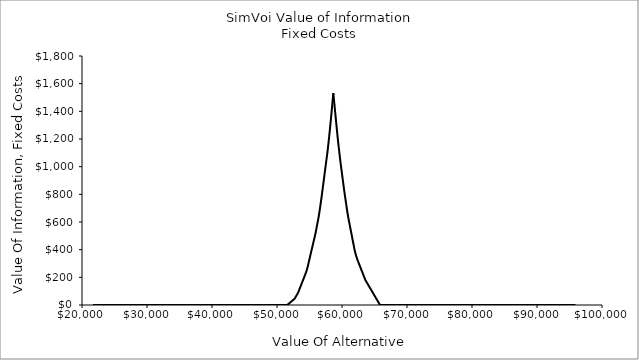
| Category | Fixed Costs |
|---|---|
| 21700.42155301782 | 0 |
| 21848.897025111157 | 0 |
| 21997.3724972045 | 0 |
| 22145.847969297836 | 0 |
| 22294.323441391174 | 0 |
| 22442.798913484516 | 0 |
| 22591.274385577854 | 0 |
| 22739.749857671195 | 0 |
| 22888.225329764533 | 0 |
| 23036.70080185787 | 0 |
| 23185.176273951212 | 0 |
| 23333.65174604455 | 0 |
| 23482.127218137888 | 0 |
| 23630.60269023123 | 0 |
| 23779.078162324568 | 0 |
| 23927.553634417905 | 0 |
| 24076.029106511247 | 0 |
| 24224.504578604585 | 0 |
| 24372.980050697923 | 0 |
| 24521.455522791264 | 0 |
| 24669.930994884602 | 0 |
| 24818.40646697794 | 0 |
| 24966.88193907128 | 0 |
| 25115.35741116462 | 0 |
| 25263.83288325796 | 0 |
| 25412.3083553513 | 0 |
| 25560.783827444637 | 0 |
| 25709.25929953798 | 0 |
| 25857.734771631316 | 0 |
| 26006.210243724658 | 0 |
| 26154.685715817996 | 0 |
| 26303.161187911333 | 0 |
| 26451.636660004675 | 0 |
| 26600.112132098013 | 0 |
| 26748.58760419135 | 0 |
| 26897.063076284692 | 0 |
| 27045.53854837803 | 0 |
| 27194.014020471368 | 0 |
| 27342.48949256471 | 0 |
| 27490.964964658047 | 0 |
| 27639.440436751385 | 0 |
| 27787.915908844727 | 0 |
| 27936.391380938065 | 0 |
| 28084.866853031403 | 0 |
| 28233.342325124744 | 0 |
| 28381.817797218082 | 0 |
| 28530.29326931142 | 0 |
| 28678.76874140476 | 0 |
| 28827.2442134981 | 0 |
| 28975.719685591437 | 0 |
| 29124.19515768478 | 0 |
| 29272.670629778117 | 0 |
| 29421.146101871458 | 0 |
| 29569.621573964796 | 0 |
| 29718.097046058137 | 0 |
| 29866.572518151475 | 0 |
| 30015.047990244813 | 0 |
| 30163.523462338155 | 0 |
| 30311.998934431493 | 0 |
| 30460.47440652483 | 0 |
| 30608.949878618172 | 0 |
| 30757.42535071151 | 0 |
| 30905.900822804848 | 0 |
| 31054.37629489819 | 0 |
| 31202.851766991527 | 0 |
| 31351.327239084865 | 0 |
| 31499.802711178207 | 0 |
| 31648.278183271545 | 0 |
| 31796.753655364882 | 0 |
| 31945.229127458224 | 0 |
| 32093.704599551562 | 0 |
| 32242.1800716449 | 0 |
| 32390.65554373824 | 0 |
| 32539.13101583158 | 0 |
| 32687.606487924917 | 0 |
| 32836.08196001826 | 0 |
| 32984.5574321116 | 0 |
| 33133.032904204934 | 0 |
| 33281.508376298276 | 0 |
| 33429.98384839162 | 0 |
| 33578.45932048495 | 0 |
| 33726.93479257829 | 0 |
| 33875.410264671635 | 0 |
| 34023.885736764976 | 0 |
| 34172.36120885831 | 0 |
| 34320.83668095165 | 0 |
| 34469.312153044986 | 0 |
| 34617.78762513833 | 0 |
| 34766.26309723167 | 0 |
| 34914.73856932501 | 0 |
| 35063.214041418345 | 0 |
| 35211.68951351169 | 0 |
| 35360.16498560502 | 0 |
| 35508.64045769836 | 0 |
| 35657.115929791704 | 0 |
| 35805.591401885045 | 0 |
| 35954.06687397838 | 0 |
| 36102.54234607172 | 0 |
| 36251.017818165055 | 0 |
| 36399.4932902584 | 0 |
| 36547.96876235174 | 0 |
| 36696.44423444508 | 0 |
| 36844.919706538414 | 0 |
| 36993.395178631756 | 0 |
| 37141.8706507251 | 0 |
| 37290.34612281843 | 0 |
| 37438.82159491177 | 0 |
| 37587.297067005115 | 0 |
| 37735.772539098456 | 0 |
| 37884.24801119179 | 0 |
| 38032.72348328513 | 0 |
| 38181.198955378466 | 0 |
| 38329.67442747181 | 0 |
| 38478.14989956515 | 0 |
| 38626.62537165849 | 0 |
| 38775.100843751825 | 0 |
| 38923.57631584517 | 0 |
| 39072.0517879385 | 0 |
| 39220.52726003184 | 0 |
| 39369.002732125184 | 0 |
| 39517.478204218525 | 0 |
| 39665.95367631186 | 0 |
| 39814.4291484052 | 0 |
| 39962.904620498535 | 0 |
| 40111.38009259188 | 0 |
| 40259.85556468522 | 0 |
| 40408.33103677856 | 0 |
| 40556.8065088719 | 0 |
| 40705.281980965236 | 0 |
| 40853.75745305857 | 0 |
| 41002.23292515191 | 0 |
| 41150.70839724525 | 0 |
| 41299.183869338594 | 0 |
| 41447.659341431936 | 0 |
| 41596.13481352527 | 0 |
| 41744.61028561861 | 0 |
| 41893.085757711946 | 0 |
| 42041.56122980529 | 0 |
| 42190.03670189863 | 0 |
| 42338.51217399197 | 0 |
| 42486.987646085305 | 0 |
| 42635.463118178646 | 0 |
| 42783.93859027198 | 0 |
| 42932.41406236532 | 0 |
| 43080.88953445866 | 0 |
| 43229.365006552005 | 0 |
| 43377.84047864534 | 0 |
| 43526.31595073868 | 0 |
| 43674.791422832015 | 0 |
| 43823.26689492536 | 0 |
| 43971.7423670187 | 0 |
| 44120.21783911204 | 0 |
| 44268.69331120538 | 0 |
| 44417.168783298715 | 0 |
| 44565.64425539205 | 0 |
| 44714.11972748539 | 0 |
| 44862.59519957873 | 0 |
| 45011.070671672074 | 0 |
| 45159.546143765416 | 0 |
| 45308.02161585875 | 0 |
| 45456.49708795209 | 0 |
| 45604.972560045426 | 0 |
| 45753.44803213877 | 0 |
| 45901.92350423211 | 0 |
| 46050.39897632545 | 0 |
| 46198.874448418785 | 0 |
| 46347.349920512126 | 0 |
| 46495.82539260546 | 0 |
| 46644.3008646988 | 0 |
| 46792.77633679214 | 0 |
| 46941.251808885485 | 0 |
| 47089.72728097882 | 0 |
| 47238.20275307216 | 0 |
| 47386.678225165495 | 0 |
| 47535.15369725884 | 0 |
| 47683.62916935218 | 0 |
| 47832.10464144552 | 0 |
| 47980.58011353886 | 0 |
| 48129.055585632195 | 0 |
| 48277.53105772553 | 0 |
| 48426.00652981887 | 0 |
| 48574.48200191221 | 0 |
| 48722.957474005554 | 0 |
| 48871.432946098896 | 0 |
| 49019.90841819223 | 0 |
| 49168.383890285564 | 0 |
| 49316.859362378906 | 0 |
| 49465.33483447225 | 0 |
| 49613.81030656559 | 0 |
| 49762.28577865893 | 0 |
| 49910.761250752264 | 0 |
| 50059.236722845606 | 0 |
| 50207.71219493894 | 0 |
| 50356.18766703228 | 0 |
| 50504.66313912562 | 0 |
| 50653.138611218965 | 0 |
| 50801.6140833123 | 0 |
| 50950.08955540564 | 0 |
| 51098.565027498975 | 0 |
| 51247.040499592316 | 0 |
| 51395.51597168566 | 0 |
| 51543.991443779 | 0 |
| 51692.46691587234 | 4.66 |
| 51840.942387965675 | 10.599 |
| 51989.41786005901 | 16.538 |
| 52137.89333215235 | 22.477 |
| 52286.36880424569 | 28.416 |
| 52434.844276339034 | 34.355 |
| 52583.319748432375 | 40.294 |
| 52731.79522052571 | 47.382 |
| 52880.270692619044 | 59.26 |
| 53028.746164712386 | 71.138 |
| 53177.22163680573 | 83.016 |
| 53325.69710889907 | 98.345 |
| 53474.17258099241 | 116.162 |
| 53622.648053085744 | 133.979 |
| 53771.123525179086 | 151.796 |
| 53919.59899727242 | 169.613 |
| 54068.07446936576 | 187.43 |
| 54216.5499414591 | 205.247 |
| 54365.025413552445 | 223.064 |
| 54513.50088564578 | 242.358 |
| 54661.97635773912 | 266.114 |
| 54810.45182983246 | 294.856 |
| 54958.927301925796 | 324.551 |
| 55107.40277401914 | 354.246 |
| 55255.87824611248 | 383.942 |
| 55404.35371820581 | 413.637 |
| 55552.829190299155 | 443.332 |
| 55701.3046623925 | 473.027 |
| 55849.78013448583 | 502.722 |
| 55998.25560657917 | 536.693 |
| 56146.731078672514 | 572.327 |
| 56295.20655076585 | 607.961 |
| 56443.68202285919 | 647.954 |
| 56592.15749495253 | 692.698 |
| 56740.632967045865 | 740.211 |
| 56889.10843913921 | 791.723 |
| 57037.58391123255 | 845.174 |
| 57186.05938332588 | 898.625 |
| 57334.534855419224 | 952.076 |
| 57483.010327512566 | 1005.527 |
| 57631.4857996059 | 1058.979 |
| 57779.96127169924 | 1112.43 |
| 57928.43674379258 | 1174.552 |
| 58076.912215885925 | 1239.881 |
| 58225.38768797926 | 1310.837 |
| 58373.8631600726 | 1382.616 |
| 58522.33863216594 | 1459.823 |
| 58661.49398605371 | 1532.184 |
| 58670.814104259276 | 1527.71 |
| 58819.28957635262 | 1456.442 |
| 58967.76504844596 | 1385.174 |
| 59116.24052053929 | 1313.906 |
| 59264.715992632635 | 1242.638 |
| 59413.19146472598 | 1175.132 |
| 59561.66693681931 | 1113.62 |
| 59710.14240891265 | 1054.229 |
| 59858.617881005994 | 999.501 |
| 60007.09335309933 | 946.05 |
| 60155.56882519267 | 892.599 |
| 60304.04429728601 | 839.148 |
| 60452.519769379345 | 790.068 |
| 60600.99524147269 | 742.556 |
| 60749.47071356603 | 695.044 |
| 60897.94618565936 | 650.99 |
| 61046.421657752704 | 612.606 |
| 61194.897129846046 | 576.972 |
| 61343.37260193938 | 541.338 |
| 61491.84807403272 | 505.704 |
| 61640.32354612606 | 470.07 |
| 61788.799018219404 | 434.436 |
| 61937.27449031274 | 398.802 |
| 62085.74996240608 | 370.058 |
| 62234.22543449942 | 346.302 |
| 62382.700906592756 | 326.005 |
| 62531.1763786861 | 308.188 |
| 62679.65185077944 | 290.371 |
| 62828.12732287277 | 272.554 |
| 62976.602794966115 | 254.737 |
| 63125.078267059456 | 236.92 |
| 63273.55373915279 | 219.103 |
| 63422.02921124613 | 201.286 |
| 63570.50468333947 | 183.469 |
| 63718.98015543281 | 170.539 |
| 63867.45562752615 | 158.661 |
| 64015.93109961949 | 146.783 |
| 64164.406571712825 | 134.905 |
| 64312.88204380617 | 123.027 |
| 64461.35751589951 | 111.148 |
| 64609.83298799284 | 99.27 |
| 64758.308460086184 | 87.392 |
| 64906.783932179525 | 75.514 |
| 65055.25940427286 | 63.636 |
| 65203.7348763662 | 51.758 |
| 65352.21034845954 | 39.88 |
| 65500.685820552884 | 28.002 |
| 65649.16129264623 | 16.124 |
| 65797.63676473955 | 4.246 |
| 65946.11223683291 | 0 |
| 66094.58770892624 | 0 |
| 66243.06318101958 | 0 |
| 66391.53865311292 | 0 |
| 66540.01412520625 | 0 |
| 66688.4895972996 | 0 |
| 66836.96506939293 | 0 |
| 66985.44054148627 | 0 |
| 67133.91601357961 | 0 |
| 67282.39148567295 | 0 |
| 67430.8669577663 | 0 |
| 67579.34242985962 | 0 |
| 67727.81790195298 | 0 |
| 67876.2933740463 | 0 |
| 68024.76884613965 | 0 |
| 68173.24431823299 | 0 |
| 68321.71979032631 | 0 |
| 68470.19526241967 | 0 |
| 68618.670734513 | 0 |
| 68767.14620660634 | 0 |
| 68915.62167869968 | 0 |
| 69064.09715079302 | 0 |
| 69212.57262288636 | 0 |
| 69361.04809497969 | 0 |
| 69509.52356707305 | 0 |
| 69657.99903916637 | 0 |
| 69806.47451125972 | 0 |
| 69954.94998335306 | 0 |
| 70103.4254554464 | 0 |
| 70251.90092753974 | 0 |
| 70400.37639963307 | 0 |
| 70548.85187172642 | 0 |
| 70697.32734381975 | 0 |
| 70845.80281591309 | 0 |
| 70994.27828800643 | 0 |
| 71142.75376009976 | 0 |
| 71291.22923219312 | 0 |
| 71439.70470428644 | 0 |
| 71588.18017637978 | 0 |
| 71736.65564847313 | 0 |
| 71885.13112056647 | 0 |
| 72033.60659265981 | 0 |
| 72182.08206475314 | 0 |
| 72330.55753684649 | 0 |
| 72479.03300893982 | 0 |
| 72627.50848103316 | 0 |
| 72775.9839531265 | 0 |
| 72924.45942521983 | 0 |
| 73072.93489731319 | 0 |
| 73221.41036940651 | 0 |
| 73369.88584149987 | 0 |
| 73518.3613135932 | 0 |
| 73666.83678568654 | 0 |
| 73815.31225777988 | 0 |
| 73963.7877298732 | 0 |
| 74112.26320196656 | 0 |
| 74260.73867405989 | 0 |
| 74409.21414615323 | 0 |
| 74557.68961824657 | 0 |
| 74706.16509033991 | 0 |
| 74854.64056243325 | 0 |
| 75003.11603452658 | 0 |
| 75151.59150661994 | 0 |
| 75300.06697871326 | 0 |
| 75448.5424508066 | 0 |
| 75597.01792289995 | 0 |
| 75745.49339499327 | 0 |
| 75893.96886708663 | 0 |
| 76042.44433917996 | 0 |
| 76190.9198112733 | 0 |
| 76339.39528336664 | 0 |
| 76487.87075545998 | 0 |
| 76636.34622755332 | 0 |
| 76784.82169964665 | 0 |
| 76933.29717174 | 0 |
| 77081.77264383333 | 0 |
| 77230.24811592668 | 0 |
| 77378.72358802002 | 0 |
| 77527.19906011336 | 0 |
| 77675.6745322067 | 0 |
| 77824.15000430003 | 0 |
| 77972.62547639338 | 0 |
| 78121.10094848671 | 0 |
| 78269.57642058005 | 0 |
| 78418.0518926734 | 0 |
| 78566.52736476672 | 0 |
| 78715.00283686008 | 0 |
| 78863.4783089534 | 0 |
| 79011.95378104674 | 0 |
| 79160.42925314009 | 0 |
| 79308.90472523343 | 0 |
| 79457.38019732677 | 0 |
| 79605.8556694201 | 0 |
| 79754.33114151345 | 0 |
| 79902.80661360678 | 0 |
| 80051.28208570012 | 0 |
| 80199.75755779346 | 0 |
| 80348.23302988679 | 0 |
| 80496.70850198015 | 0 |
| 80645.18397407347 | 0 |
| 80793.65944616683 | 0 |
| 80942.13491826016 | 0 |
| 81090.6103903535 | 0 |
| 81239.08586244684 | 0 |
| 81387.56133454017 | 0 |
| 81536.03680663352 | 0 |
| 81684.51227872685 | 0 |
| 81832.98775082019 | 0 |
| 81981.46322291353 | 0 |
| 82129.93869500687 | 0 |
| 82278.41416710021 | 0 |
| 82426.88963919354 | 0 |
| 82575.3651112869 | 0 |
| 82723.84058338022 | 0 |
| 82872.31605547357 | 0 |
| 83020.79152756691 | 0 |
| 83169.26699966023 | 0 |
| 83317.74247175359 | 0 |
| 83466.21794384692 | 0 |
| 83614.69341594026 | 0 |
| 83763.1688880336 | 0 |
| 83911.64436012694 | 0 |
| 84060.11983222028 | 0 |
| 84208.59530431361 | 0 |
| 84357.07077640697 | 0 |
| 84505.5462485003 | 0 |
| 84654.02172059364 | 0 |
| 84802.49719268698 | 0 |
| 84950.97266478032 | 0 |
| 85099.44813687366 | 0 |
| 85247.92360896699 | 0 |
| 85396.39908106034 | 0 |
| 85544.87455315367 | 0 |
| 85693.35002524701 | 0 |
| 85841.82549734035 | 0 |
| 85990.30096943368 | 0 |
| 86138.77644152704 | 0 |
| 86287.25191362036 | 0 |
| 86435.7273857137 | 0 |
| 86584.20285780705 | 0 |
| 86732.67832990039 | 0 |
| 86881.15380199373 | 0 |
| 87029.62927408706 | 0 |
| 87178.10474618041 | 0 |
| 87326.58021827374 | 0 |
| 87475.05569036708 | 0 |
| 87623.53116246042 | 0 |
| 87772.00663455376 | 0 |
| 87920.4821066471 | 0 |
| 88068.95757874043 | 0 |
| 88217.43305083377 | 0 |
| 88365.90852292711 | 0 |
| 88514.38399502046 | 0 |
| 88662.8594671138 | 0 |
| 88811.33493920714 | 0 |
| 88959.81041130047 | 0 |
| 89108.28588339381 | 0 |
| 89256.76135548715 | 0 |
| 89405.23682758049 | 0 |
| 89553.71229967383 | 0 |
| 89702.18777176717 | 0 |
| 89850.6632438605 | 0 |
| 89999.13871595384 | 0 |
| 90147.61418804718 | 0 |
| 90296.08966014053 | 0 |
| 90444.56513223387 | 0 |
| 90593.04060432721 | 0 |
| 90741.51607642055 | 0 |
| 90889.99154851388 | 0 |
| 91038.46702060722 | 0 |
| 91186.94249270056 | 0 |
| 91335.4179647939 | 0 |
| 91483.89343688724 | 0 |
| 91632.36890898058 | 0 |
| 91780.84438107391 | 0 |
| 91929.31985316725 | 0 |
| 92077.7953252606 | 0 |
| 92226.27079735394 | 0 |
| 92374.74626944728 | 0 |
| 92523.22174154062 | 0 |
| 92671.69721363395 | 0 |
| 92820.17268572729 | 0 |
| 92968.64815782063 | 0 |
| 93117.12362991397 | 0 |
| 93265.59910200731 | 0 |
| 93414.07457410065 | 0 |
| 93562.55004619398 | 0 |
| 93711.02551828732 | 0 |
| 93859.50099038066 | 0 |
| 94007.976462474 | 0 |
| 94156.45193456735 | 0 |
| 94304.92740666069 | 0 |
| 94453.40287875403 | 0 |
| 94601.87835084736 | 0 |
| 94750.3538229407 | 0 |
| 94898.82929503404 | 0 |
| 95047.30476712738 | 0 |
| 95195.78023922072 | 0 |
| 95344.25571131406 | 0 |
| 95492.73118340739 | 0 |
| 95641.20665550073 | 0 |
| 95789.68212759407 | 0 |
| 95938.15759968742 | 0 |